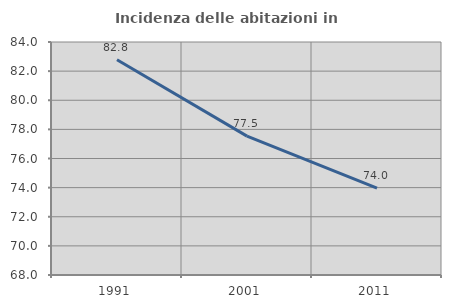
| Category | Incidenza delle abitazioni in proprietà  |
|---|---|
| 1991.0 | 82.781 |
| 2001.0 | 77.538 |
| 2011.0 | 73.962 |